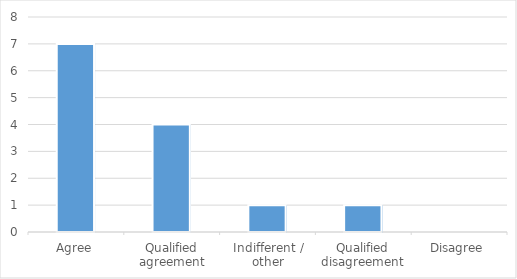
| Category | Series 0 |
|---|---|
| Agree | 7 |
| Qualified agreement | 4 |
| Indifferent / other | 1 |
| Qualified disagreement | 1 |
| Disagree | 0 |